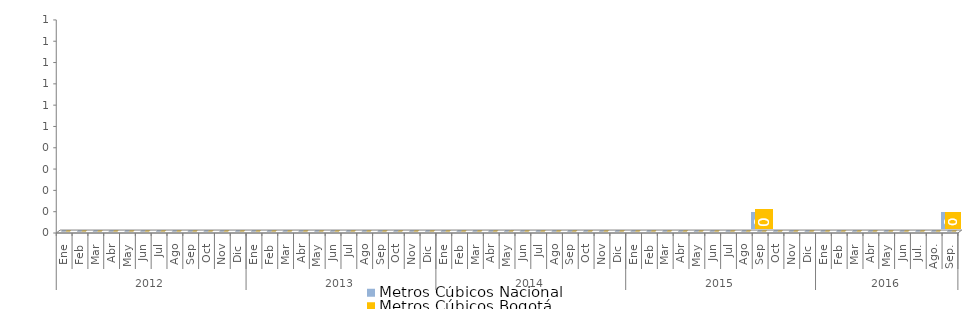
| Category | Metros Cúbicos Nacional | Metros Cúbicos Bogotá |
|---|---|---|
| 0 | 0 | 0 |
| 1 | 0 | 0 |
| 2 | 0 | 0 |
| 3 | 0 | 0 |
| 4 | 0 | 0 |
| 5 | 0 | 0 |
| 6 | 0 | 0 |
| 7 | 0 | 0 |
| 8 | 0 | 0 |
| 9 | 0 | 0 |
| 10 | 0 | 0 |
| 11 | 0 | 0 |
| 12 | 0 | 0 |
| 13 | 0 | 0 |
| 14 | 0 | 0 |
| 15 | 0 | 0 |
| 16 | 0 | 0 |
| 17 | 0 | 0 |
| 18 | 0 | 0 |
| 19 | 0 | 0 |
| 20 | 0 | 0 |
| 21 | 0 | 0 |
| 22 | 0 | 0 |
| 23 | 0 | 0 |
| 24 | 0 | 0 |
| 25 | 0 | 0 |
| 26 | 0 | 0 |
| 27 | 0 | 0 |
| 28 | 0 | 0 |
| 29 | 0 | 0 |
| 30 | 0 | 0 |
| 31 | 0 | 0 |
| 32 | 0 | 0 |
| 33 | 0 | 0 |
| 34 | 0 | 0 |
| 35 | 0 | 0 |
| 36 | 0 | 0 |
| 37 | 0 | 0 |
| 38 | 0 | 0 |
| 39 | 0 | 0 |
| 40 | 0 | 0 |
| 41 | 0 | 0 |
| 42 | 0 | 0 |
| 43 | 0 | 0 |
| 44 | 0 | 0 |
| 45 | 0 | 0 |
| 46 | 0 | 0 |
| 47 | 0 | 0 |
| 48 | 0 | 0 |
| 49 | 0 | 0 |
| 50 | 0 | 0 |
| 51 | 0 | 0 |
| 52 | 0 | 0 |
| 53 | 0 | 0 |
| 54 | 0 | 0 |
| 55 | 0 | 0 |
| 56 | 0 | 0 |